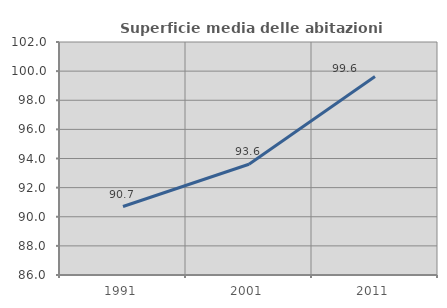
| Category | Superficie media delle abitazioni occupate |
|---|---|
| 1991.0 | 90.702 |
| 2001.0 | 93.604 |
| 2011.0 | 99.636 |